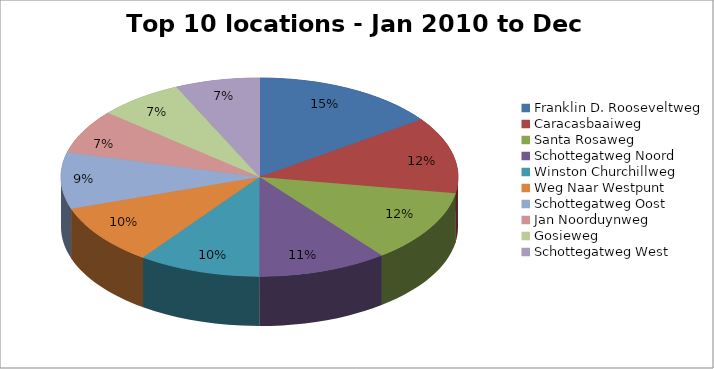
| Category | Series 0 |
|---|---|
| Franklin D. Rooseveltweg | 3825 |
| Caracasbaaiweg | 3148 |
| Santa Rosaweg | 2998 |
| Schottegatweg Noord | 2669 |
| Winston Churchillweg | 2514 |
| Weg Naar Westpunt | 2488 |
| Schottegatweg Oost | 2327 |
| Jan Noorduynweg | 1815 |
| Gosieweg | 1751 |
| Schottegatweg West | 1736 |